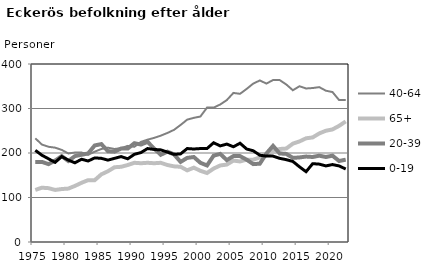
| Category | 40-64 | 65+ | 20-39 | 0-19 |
|---|---|---|---|---|
| 1975.0 | 233 | 117 | 180 | 206 |
| 1976.0 | 219 | 122 | 180 | 195 |
| 1977.0 | 214 | 121 | 175 | 187 |
| 1978.0 | 212 | 117 | 183 | 179 |
| 1979.0 | 207 | 119 | 193 | 192 |
| 1980.0 | 199 | 120 | 182 | 184 |
| 1981.0 | 201 | 126 | 193 | 178 |
| 1982.0 | 201 | 133 | 196 | 186 |
| 1983.0 | 196 | 139 | 199 | 182 |
| 1984.0 | 203 | 139 | 217 | 189 |
| 1985.0 | 209 | 152 | 220 | 188 |
| 1986.0 | 212 | 159 | 204 | 184 |
| 1987.0 | 209 | 168 | 203 | 188 |
| 1988.0 | 211 | 169 | 210 | 192 |
| 1989.0 | 216 | 173 | 210 | 187 |
| 1990.0 | 214 | 178 | 222 | 197 |
| 1991.0 | 225 | 177 | 219 | 201 |
| 1992.0 | 230 | 178 | 225 | 210 |
| 1993.0 | 234 | 177 | 210 | 208 |
| 1994.0 | 239 | 178 | 196 | 207 |
| 1995.0 | 245 | 173 | 203 | 202 |
| 1996.0 | 252 | 170 | 197 | 197 |
| 1997.0 | 263 | 169 | 180 | 198 |
| 1998.0 | 275 | 161 | 189 | 210 |
| 1999.0 | 279 | 167 | 191 | 209 |
| 2000.0 | 282 | 160 | 178 | 210 |
| 2001.0 | 302 | 155 | 172 | 210 |
| 2002.0 | 302 | 165 | 194 | 223 |
| 2003.0 | 309 | 172 | 198 | 216 |
| 2004.0 | 319 | 174 | 184 | 220 |
| 2005.0 | 335 | 183 | 193 | 214 |
| 2006.0 | 333 | 181 | 193 | 222 |
| 2007.0 | 344 | 185 | 185 | 209 |
| 2008.0 | 356 | 185 | 175 | 205 |
| 2009.0 | 363 | 190 | 176 | 195 |
| 2010.0 | 356 | 195 | 199 | 193 |
| 2011.0 | 364 | 205 | 216 | 193 |
| 2012.0 | 364 | 209 | 199 | 188 |
| 2013.0 | 354 | 210 | 198 | 185 |
| 2014.0 | 341 | 221 | 189 | 181 |
| 2015.0 | 350 | 226 | 190 | 169 |
| 2016.0 | 345 | 233 | 192 | 158 |
| 2017.0 | 346 | 235 | 191 | 176 |
| 2018.0 | 348 | 244 | 194 | 175 |
| 2019.0 | 340 | 250 | 191 | 171 |
| 2020.0 | 337 | 253 | 194 | 174 |
| 2021.0 | 319 | 261 | 182 | 171 |
| 2022.0 | 319 | 271 | 185 | 164 |